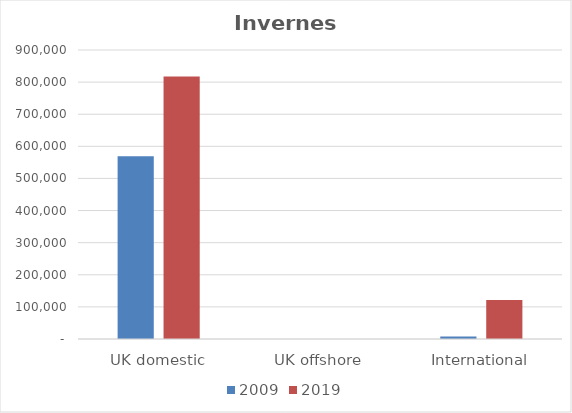
| Category | 2009 | 2019 |
|---|---|---|
| UK domestic | 569300 | 817364 |
| UK offshore | 37 | 23 |
| International | 7439 | 121157 |